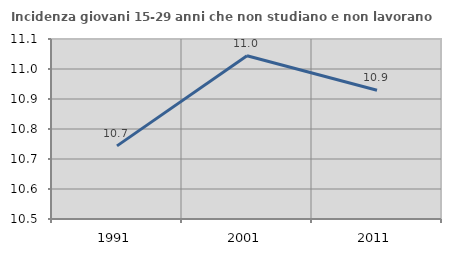
| Category | Incidenza giovani 15-29 anni che non studiano e non lavorano  |
|---|---|
| 1991.0 | 10.744 |
| 2001.0 | 11.044 |
| 2011.0 | 10.929 |